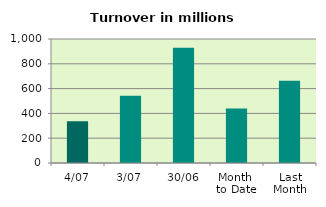
| Category | Series 0 |
|---|---|
| 4/07 | 336.656 |
| 3/07 | 542.208 |
| 30/06 | 930.062 |
| Month 
to Date | 439.432 |
| Last
Month | 663.186 |